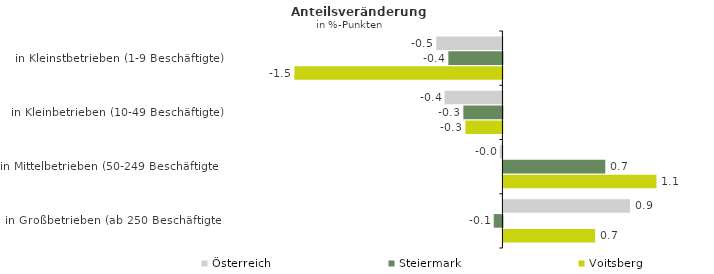
| Category | Österreich | Steiermark | Voitsberg |
|---|---|---|---|
| in Kleinstbetrieben (1-9 Beschäftigte) | -0.48 | -0.393 | -1.51 |
| in Kleinbetrieben (10-49 Beschäftigte) | -0.42 | -0.284 | -0.269 |
| in Mittelbetrieben (50-249 Beschäftigte) | -0.019 | 0.74 | 1.111 |
| in Großbetrieben (ab 250 Beschäftigte) | 0.919 | -0.063 | 0.666 |